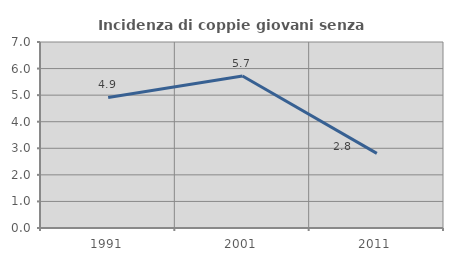
| Category | Incidenza di coppie giovani senza figli |
|---|---|
| 1991.0 | 4.912 |
| 2001.0 | 5.719 |
| 2011.0 | 2.808 |